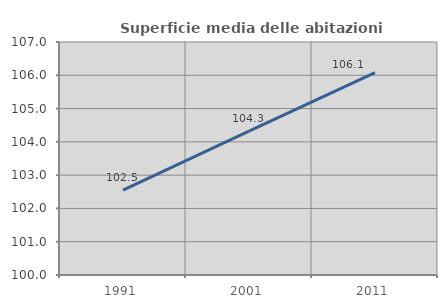
| Category | Superficie media delle abitazioni occupate |
|---|---|
| 1991.0 | 102.547 |
| 2001.0 | 104.322 |
| 2011.0 | 106.078 |